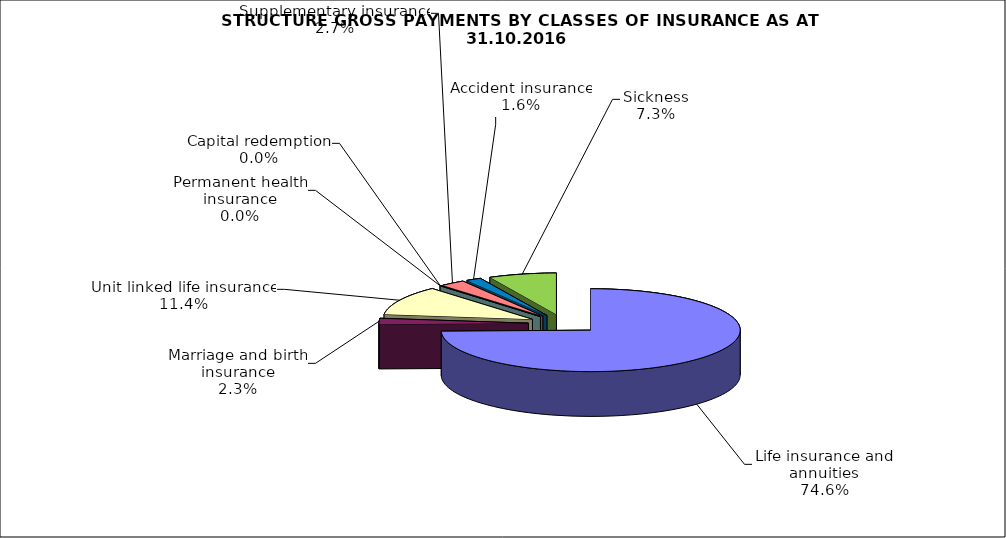
| Category | Series 0 |
|---|---|
| Life insurance and annuities | 100069442.948 |
| Marriage and birth insurance | 3051578.507 |
| Unit linked life insurance | 15294681.665 |
| Permanent health insurance | 46882.19 |
| Capital redemption | 0 |
| Supplementary insurance | 3598667.602 |
| Accident insurance | 2199797.296 |
| Sickness | 9851151.36 |